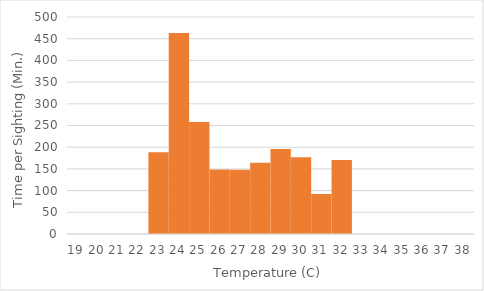
| Category | Time/Sightings |
|---|---|
| 19.0 | 0 |
| 20.0 | 0 |
| 21.0 | 0 |
| 22.0 | 0 |
| 23.0 | 188.5 |
| 24.0 | 463 |
| 25.0 | 258 |
| 26.0 | 148.75 |
| 27.0 | 148.2 |
| 28.0 | 164 |
| 29.0 | 195.8 |
| 30.0 | 177 |
| 31.0 | 92.167 |
| 32.0 | 170.5 |
| 33.0 | 0 |
| 34.0 | 0 |
| 35.0 | 0 |
| 36.0 | 0 |
| 37.0 | 0 |
| 38.0 | 0 |